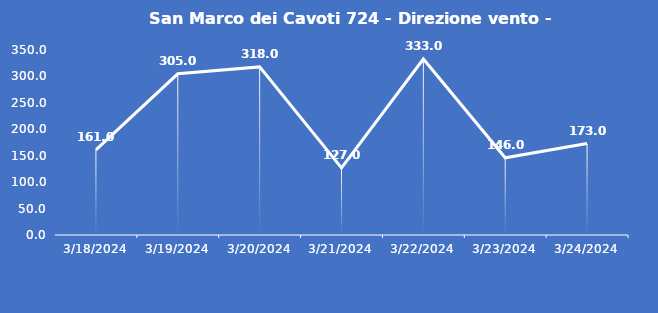
| Category | San Marco dei Cavoti 724 - Direzione vento - Grezzo (°N) |
|---|---|
| 3/18/24 | 161 |
| 3/19/24 | 305 |
| 3/20/24 | 318 |
| 3/21/24 | 127 |
| 3/22/24 | 333 |
| 3/23/24 | 146 |
| 3/24/24 | 173 |